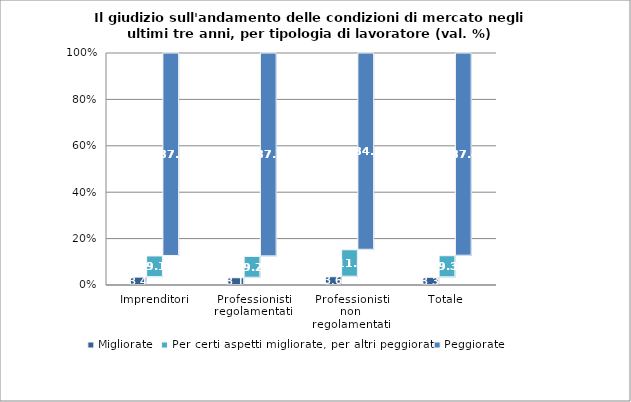
| Category | Migliorate | Per certi aspetti migliorate, per altri peggiorate | Peggiorate |
|---|---|---|---|
| Imprenditori | 3.397 | 9.118 | 87.496 |
| Professionisti regolamentati | 3.13 | 9.208 | 87.662 |
| Professionisti non regolamentati | 3.575 | 11.593 | 84.724 |
| Totale | 3.32 | 9.3 | 87.38 |